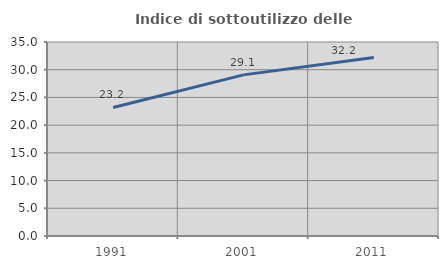
| Category | Indice di sottoutilizzo delle abitazioni  |
|---|---|
| 1991.0 | 23.195 |
| 2001.0 | 29.067 |
| 2011.0 | 32.209 |